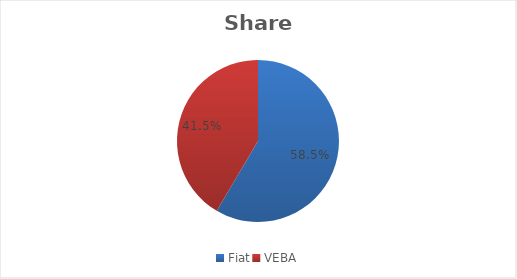
| Category | Series 0 |
|---|---|
| Fiat | 0.585 |
| VEBA | 0.415 |